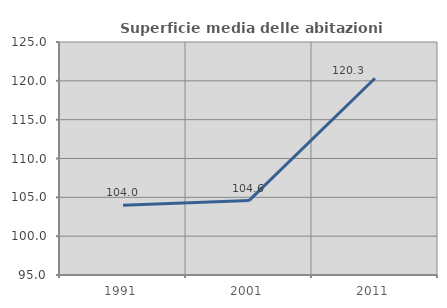
| Category | Superficie media delle abitazioni occupate |
|---|---|
| 1991.0 | 103.973 |
| 2001.0 | 104.58 |
| 2011.0 | 120.332 |